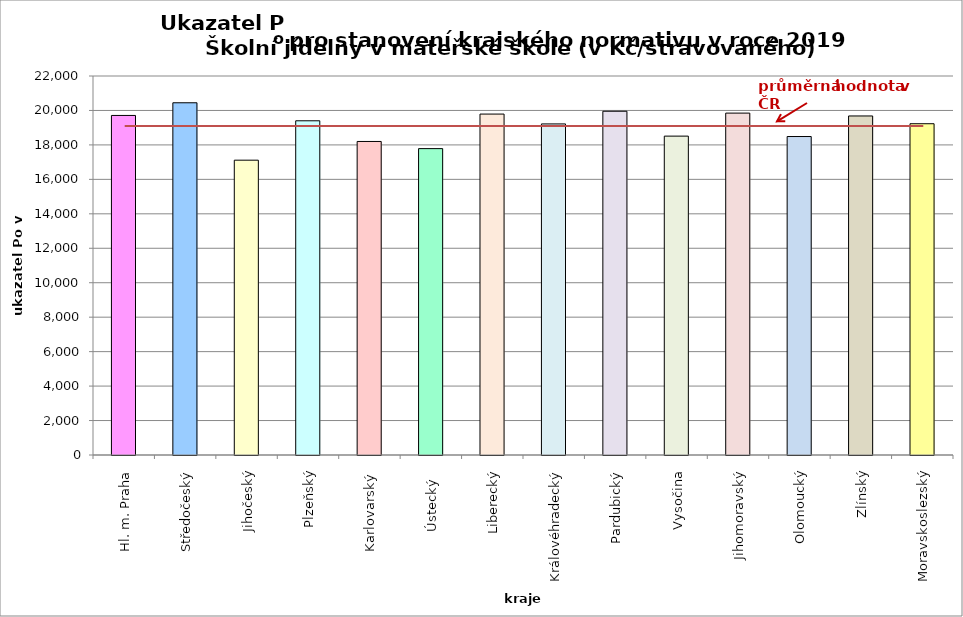
| Category | Series 0 |
|---|---|
| Hl. m. Praha | 19710 |
| Středočeský | 20446 |
| Jihočeský | 17114 |
| Plzeňský | 19400 |
| Karlovarský  | 18200 |
| Ústecký   | 17785 |
| Liberecký | 19790 |
| Královéhradecký | 19219 |
| Pardubický | 19954 |
| Vysočina | 18510 |
| Jihomoravský | 19846 |
| Olomoucký | 18487 |
| Zlínský | 19680 |
| Moravskoslezský | 19230 |